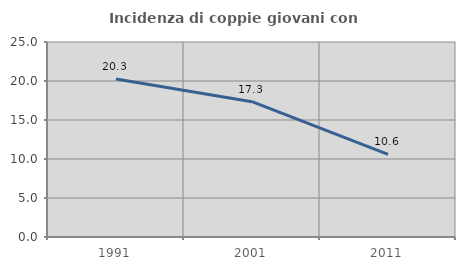
| Category | Incidenza di coppie giovani con figli |
|---|---|
| 1991.0 | 20.268 |
| 2001.0 | 17.349 |
| 2011.0 | 10.604 |